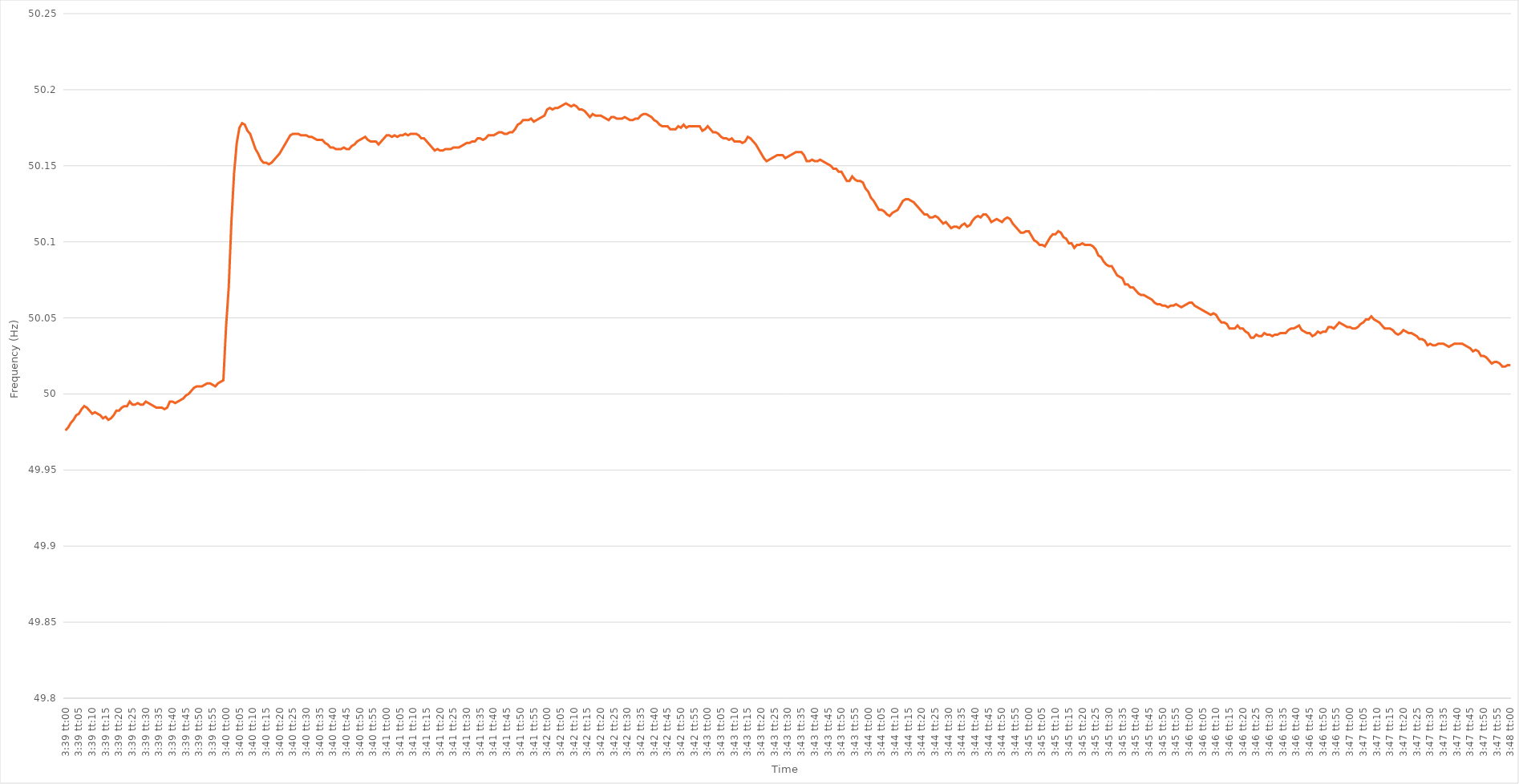
| Category | Series 0 |
|---|---|
| 0.15208333333333332 | 49.976 |
| 0.15209490740740741 | 49.978 |
| 0.15210648148148148 | 49.981 |
| 0.15211805555555555 | 49.983 |
| 0.15212962962962964 | 49.986 |
| 0.1521412037037037 | 49.987 |
| 0.15215277777777778 | 49.99 |
| 0.15216435185185184 | 49.992 |
| 0.1521759259259259 | 49.991 |
| 0.1521875 | 49.989 |
| 0.15219907407407407 | 49.987 |
| 0.15221064814814814 | 49.988 |
| 0.15222222222222223 | 49.987 |
| 0.1522337962962963 | 49.986 |
| 0.15224537037037036 | 49.984 |
| 0.15225694444444446 | 49.985 |
| 0.15226851851851853 | 49.983 |
| 0.1522800925925926 | 49.984 |
| 0.15229166666666666 | 49.986 |
| 0.15230324074074075 | 49.989 |
| 0.15231481481481482 | 49.989 |
| 0.1523263888888889 | 49.991 |
| 0.15233796296296295 | 49.992 |
| 0.15234953703703705 | 49.992 |
| 0.1523611111111111 | 49.995 |
| 0.15237268518518518 | 49.993 |
| 0.15238425925925925 | 49.993 |
| 0.15239583333333334 | 49.994 |
| 0.1524074074074074 | 49.993 |
| 0.15241898148148147 | 49.993 |
| 0.15243055555555554 | 49.995 |
| 0.15244212962962964 | 49.994 |
| 0.1524537037037037 | 49.993 |
| 0.15246527777777777 | 49.992 |
| 0.15247685185185186 | 49.991 |
| 0.15248842592592593 | 49.991 |
| 0.1525 | 49.991 |
| 0.1525115740740741 | 49.99 |
| 0.15252314814814816 | 49.991 |
| 0.15253472222222222 | 49.995 |
| 0.1525462962962963 | 49.995 |
| 0.15255787037037036 | 49.994 |
| 0.15256944444444445 | 49.995 |
| 0.15258101851851852 | 49.996 |
| 0.15259259259259259 | 49.997 |
| 0.15260416666666668 | 49.999 |
| 0.15261574074074075 | 50 |
| 0.1526273148148148 | 50.002 |
| 0.15263888888888888 | 50.004 |
| 0.15265046296296295 | 50.005 |
| 0.15266203703703704 | 50.005 |
| 0.1526736111111111 | 50.005 |
| 0.15268518518518517 | 50.006 |
| 0.15269675925925927 | 50.007 |
| 0.15270833333333333 | 50.007 |
| 0.1527199074074074 | 50.006 |
| 0.1527314814814815 | 50.005 |
| 0.15274305555555556 | 50.007 |
| 0.15275462962962963 | 50.008 |
| 0.15276620370370372 | 50.009 |
| 0.15277777777777776 | 50.044 |
| 0.15278935185185186 | 50.07 |
| 0.15280092592592592 | 50.113 |
| 0.1528125 | 50.145 |
| 0.15282407407407408 | 50.165 |
| 0.15283564814814815 | 50.175 |
| 0.15284722222222222 | 50.178 |
| 0.1528587962962963 | 50.177 |
| 0.15287037037037035 | 50.173 |
| 0.15288194444444445 | 50.171 |
| 0.1528935185185185 | 50.166 |
| 0.15290509259259258 | 50.161 |
| 0.15291666666666667 | 50.158 |
| 0.15292824074074074 | 50.154 |
| 0.1529398148148148 | 50.152 |
| 0.1529513888888889 | 50.152 |
| 0.15296296296296297 | 50.151 |
| 0.15297453703703703 | 50.152 |
| 0.15298611111111113 | 50.154 |
| 0.1529976851851852 | 50.156 |
| 0.15300925925925926 | 50.158 |
| 0.15302083333333333 | 50.161 |
| 0.1530324074074074 | 50.164 |
| 0.1530439814814815 | 50.167 |
| 0.15305555555555556 | 50.17 |
| 0.15306712962962962 | 50.171 |
| 0.15307870370370372 | 50.171 |
| 0.15309027777777778 | 50.171 |
| 0.15310185185185185 | 50.17 |
| 0.15311342592592592 | 50.17 |
| 0.15312499999999998 | 50.17 |
| 0.15313657407407408 | 50.169 |
| 0.15314814814814814 | 50.169 |
| 0.1531597222222222 | 50.168 |
| 0.1531712962962963 | 50.167 |
| 0.15318287037037037 | 50.167 |
| 0.15319444444444444 | 50.167 |
| 0.15320601851851853 | 50.165 |
| 0.1532175925925926 | 50.164 |
| 0.15322916666666667 | 50.162 |
| 0.15324074074074073 | 50.162 |
| 0.1532523148148148 | 50.161 |
| 0.1532638888888889 | 50.161 |
| 0.15327546296296296 | 50.161 |
| 0.15328703703703703 | 50.162 |
| 0.15329861111111112 | 50.161 |
| 0.1533101851851852 | 50.161 |
| 0.15332175925925925 | 50.163 |
| 0.15333333333333332 | 50.164 |
| 0.15334490740740742 | 50.166 |
| 0.15335648148148148 | 50.167 |
| 0.15336805555555555 | 50.168 |
| 0.15337962962962962 | 50.169 |
| 0.1533912037037037 | 50.167 |
| 0.15340277777777778 | 50.166 |
| 0.15341435185185184 | 50.166 |
| 0.15342592592592594 | 50.166 |
| 0.1534375 | 50.164 |
| 0.15344907407407407 | 50.166 |
| 0.15346064814814817 | 50.168 |
| 0.15347222222222223 | 50.17 |
| 0.1534837962962963 | 50.17 |
| 0.15349537037037037 | 50.169 |
| 0.15350694444444443 | 50.17 |
| 0.15351851851851853 | 50.169 |
| 0.1535300925925926 | 50.17 |
| 0.15354166666666666 | 50.17 |
| 0.15355324074074075 | 50.171 |
| 0.15356481481481482 | 50.17 |
| 0.1535763888888889 | 50.171 |
| 0.15358796296296295 | 50.171 |
| 0.15359953703703702 | 50.171 |
| 0.15361111111111111 | 50.17 |
| 0.15362268518518518 | 50.168 |
| 0.15363425925925925 | 50.168 |
| 0.15364583333333334 | 50.166 |
| 0.1536574074074074 | 50.164 |
| 0.15366898148148148 | 50.162 |
| 0.15368055555555557 | 50.16 |
| 0.15369212962962964 | 50.161 |
| 0.1537037037037037 | 50.16 |
| 0.1537152777777778 | 50.16 |
| 0.15372685185185184 | 50.161 |
| 0.15373842592592593 | 50.161 |
| 0.15375 | 50.161 |
| 0.15376157407407406 | 50.162 |
| 0.15377314814814816 | 50.162 |
| 0.15378472222222223 | 50.162 |
| 0.1537962962962963 | 50.163 |
| 0.1538078703703704 | 50.164 |
| 0.15381944444444443 | 50.165 |
| 0.15383101851851852 | 50.165 |
| 0.1538425925925926 | 50.166 |
| 0.15385416666666665 | 50.166 |
| 0.15386574074074075 | 50.168 |
| 0.15387731481481481 | 50.168 |
| 0.15388888888888888 | 50.167 |
| 0.15390046296296298 | 50.168 |
| 0.15391203703703704 | 50.17 |
| 0.1539236111111111 | 50.17 |
| 0.1539351851851852 | 50.17 |
| 0.15394675925925924 | 50.171 |
| 0.15395833333333334 | 50.172 |
| 0.1539699074074074 | 50.172 |
| 0.15398148148148147 | 50.171 |
| 0.15399305555555556 | 50.171 |
| 0.15400462962962963 | 50.172 |
| 0.1540162037037037 | 50.172 |
| 0.1540277777777778 | 50.174 |
| 0.15403935185185186 | 50.177 |
| 0.15405092592592592 | 50.178 |
| 0.1540625 | 50.18 |
| 0.15407407407407406 | 50.18 |
| 0.15408564814814815 | 50.18 |
| 0.15409722222222222 | 50.181 |
| 0.15410879629629629 | 50.179 |
| 0.15412037037037038 | 50.18 |
| 0.15413194444444445 | 50.181 |
| 0.1541435185185185 | 50.182 |
| 0.1541550925925926 | 50.183 |
| 0.15416666666666667 | 50.187 |
| 0.15417824074074074 | 50.188 |
| 0.1541898148148148 | 50.187 |
| 0.15420138888888887 | 50.188 |
| 0.15421296296296297 | 50.188 |
| 0.15422453703703703 | 50.189 |
| 0.1542361111111111 | 50.19 |
| 0.1542476851851852 | 50.191 |
| 0.15425925925925926 | 50.19 |
| 0.15427083333333333 | 50.189 |
| 0.1542824074074074 | 50.19 |
| 0.15429398148148146 | 50.189 |
| 0.15430555555555556 | 50.187 |
| 0.15431712962962962 | 50.187 |
| 0.1543287037037037 | 50.186 |
| 0.15434027777777778 | 50.184 |
| 0.15435185185185185 | 50.182 |
| 0.15436342592592592 | 50.184 |
| 0.154375 | 50.183 |
| 0.15438657407407408 | 50.183 |
| 0.15439814814814815 | 50.183 |
| 0.15440972222222224 | 50.182 |
| 0.1544212962962963 | 50.181 |
| 0.15443287037037037 | 50.18 |
| 0.15444444444444444 | 50.182 |
| 0.1544560185185185 | 50.182 |
| 0.1544675925925926 | 50.181 |
| 0.15447916666666667 | 50.181 |
| 0.15449074074074073 | 50.181 |
| 0.15450231481481483 | 50.182 |
| 0.1545138888888889 | 50.181 |
| 0.15452546296296296 | 50.18 |
| 0.15453703703703703 | 50.18 |
| 0.1545486111111111 | 50.181 |
| 0.1545601851851852 | 50.181 |
| 0.15457175925925926 | 50.183 |
| 0.15458333333333332 | 50.184 |
| 0.15459490740740742 | 50.184 |
| 0.15460648148148148 | 50.183 |
| 0.15461805555555555 | 50.182 |
| 0.15462962962962964 | 50.18 |
| 0.1546412037037037 | 50.179 |
| 0.15465277777777778 | 50.177 |
| 0.15466435185185187 | 50.176 |
| 0.1546759259259259 | 50.176 |
| 0.1546875 | 50.176 |
| 0.15469907407407407 | 50.174 |
| 0.15471064814814814 | 50.174 |
| 0.15472222222222223 | 50.174 |
| 0.1547337962962963 | 50.176 |
| 0.15474537037037037 | 50.175 |
| 0.15475694444444446 | 50.177 |
| 0.1547685185185185 | 50.175 |
| 0.1547800925925926 | 50.176 |
| 0.15479166666666666 | 50.176 |
| 0.15480324074074073 | 50.176 |
| 0.15481481481481482 | 50.176 |
| 0.1548263888888889 | 50.176 |
| 0.15483796296296296 | 50.173 |
| 0.15484953703703705 | 50.174 |
| 0.15486111111111112 | 50.176 |
| 0.15487268518518518 | 50.174 |
| 0.15488425925925928 | 50.172 |
| 0.15489583333333332 | 50.172 |
| 0.1549074074074074 | 50.171 |
| 0.15491898148148148 | 50.169 |
| 0.15493055555555554 | 50.168 |
| 0.15494212962962964 | 50.168 |
| 0.1549537037037037 | 50.167 |
| 0.15496527777777777 | 50.168 |
| 0.15497685185185187 | 50.166 |
| 0.1549884259259259 | 50.166 |
| 0.155 | 50.166 |
| 0.15501157407407407 | 50.165 |
| 0.15502314814814813 | 50.166 |
| 0.15503472222222223 | 50.169 |
| 0.1550462962962963 | 50.168 |
| 0.15505787037037036 | 50.166 |
| 0.15506944444444445 | 50.164 |
| 0.15508101851851852 | 50.161 |
| 0.1550925925925926 | 50.158 |
| 0.15510416666666668 | 50.155 |
| 0.15511574074074075 | 50.153 |
| 0.15512731481481482 | 50.154 |
| 0.15513888888888888 | 50.155 |
| 0.15515046296296295 | 50.156 |
| 0.15516203703703704 | 50.157 |
| 0.1551736111111111 | 50.157 |
| 0.15518518518518518 | 50.157 |
| 0.15519675925925927 | 50.155 |
| 0.15520833333333334 | 50.156 |
| 0.1552199074074074 | 50.157 |
| 0.15523148148148147 | 50.158 |
| 0.15524305555555554 | 50.159 |
| 0.15525462962962963 | 50.159 |
| 0.1552662037037037 | 50.159 |
| 0.15527777777777776 | 50.157 |
| 0.15528935185185186 | 50.153 |
| 0.15530092592592593 | 50.153 |
| 0.1553125 | 50.154 |
| 0.1553240740740741 | 50.153 |
| 0.15533564814814815 | 50.153 |
| 0.15534722222222222 | 50.154 |
| 0.15535879629629631 | 50.153 |
| 0.15537037037037038 | 50.152 |
| 0.15538194444444445 | 50.151 |
| 0.15539351851851851 | 50.15 |
| 0.15540509259259258 | 50.148 |
| 0.15541666666666668 | 50.148 |
| 0.15542824074074074 | 50.146 |
| 0.1554398148148148 | 50.146 |
| 0.1554513888888889 | 50.143 |
| 0.15546296296296297 | 50.14 |
| 0.15547453703703704 | 50.14 |
| 0.1554861111111111 | 50.143 |
| 0.15549768518518517 | 50.141 |
| 0.15550925925925926 | 50.14 |
| 0.15552083333333333 | 50.14 |
| 0.1555324074074074 | 50.139 |
| 0.1555439814814815 | 50.135 |
| 0.15555555555555556 | 50.133 |
| 0.15556712962962962 | 50.129 |
| 0.15557870370370372 | 50.127 |
| 0.15559027777777779 | 50.124 |
| 0.15560185185185185 | 50.121 |
| 0.15561342592592595 | 50.121 |
| 0.15562499999999999 | 50.12 |
| 0.15563657407407408 | 50.118 |
| 0.15564814814814815 | 50.117 |
| 0.1556597222222222 | 50.119 |
| 0.1556712962962963 | 50.12 |
| 0.15568287037037037 | 50.121 |
| 0.15569444444444444 | 50.124 |
| 0.15570601851851854 | 50.127 |
| 0.15571759259259257 | 50.128 |
| 0.15572916666666667 | 50.128 |
| 0.15574074074074074 | 50.127 |
| 0.1557523148148148 | 50.126 |
| 0.1557638888888889 | 50.124 |
| 0.15577546296296296 | 50.122 |
| 0.15578703703703703 | 50.12 |
| 0.15579861111111112 | 50.118 |
| 0.1558101851851852 | 50.118 |
| 0.15582175925925926 | 50.116 |
| 0.15583333333333335 | 50.116 |
| 0.1558449074074074 | 50.117 |
| 0.15585648148148148 | 50.116 |
| 0.15586805555555555 | 50.114 |
| 0.15587962962962962 | 50.112 |
| 0.1558912037037037 | 50.113 |
| 0.15590277777777778 | 50.111 |
| 0.15591435185185185 | 50.109 |
| 0.15592592592592594 | 50.11 |
| 0.15593749999999998 | 50.11 |
| 0.15594907407407407 | 50.109 |
| 0.15596064814814814 | 50.111 |
| 0.1559722222222222 | 50.112 |
| 0.1559837962962963 | 50.11 |
| 0.15599537037037037 | 50.111 |
| 0.15600694444444443 | 50.114 |
| 0.15601851851851853 | 50.116 |
| 0.1560300925925926 | 50.117 |
| 0.15604166666666666 | 50.116 |
| 0.15605324074074076 | 50.118 |
| 0.15606481481481482 | 50.118 |
| 0.1560763888888889 | 50.116 |
| 0.15608796296296296 | 50.113 |
| 0.15609953703703702 | 50.114 |
| 0.15611111111111112 | 50.115 |
| 0.15612268518518518 | 50.114 |
| 0.15613425925925925 | 50.113 |
| 0.15614583333333334 | 50.115 |
| 0.1561574074074074 | 50.116 |
| 0.15616898148148148 | 50.115 |
| 0.15618055555555554 | 50.112 |
| 0.1561921296296296 | 50.11 |
| 0.1562037037037037 | 50.108 |
| 0.15621527777777777 | 50.106 |
| 0.15622685185185184 | 50.106 |
| 0.15623842592592593 | 50.107 |
| 0.15625 | 50.107 |
| 0.15626157407407407 | 50.104 |
| 0.15627314814814816 | 50.101 |
| 0.15628472222222223 | 50.1 |
| 0.1562962962962963 | 50.098 |
| 0.1563078703703704 | 50.098 |
| 0.15631944444444446 | 50.097 |
| 0.15633101851851852 | 50.1 |
| 0.1563425925925926 | 50.103 |
| 0.15635416666666666 | 50.105 |
| 0.15636574074074075 | 50.105 |
| 0.15637731481481482 | 50.107 |
| 0.15638888888888888 | 50.106 |
| 0.15640046296296298 | 50.103 |
| 0.15641203703703704 | 50.102 |
| 0.1564236111111111 | 50.099 |
| 0.15643518518518518 | 50.099 |
| 0.15644675925925924 | 50.096 |
| 0.15645833333333334 | 50.098 |
| 0.1564699074074074 | 50.098 |
| 0.15648148148148147 | 50.099 |
| 0.15649305555555557 | 50.098 |
| 0.15650462962962963 | 50.098 |
| 0.1565162037037037 | 50.098 |
| 0.1565277777777778 | 50.097 |
| 0.15653935185185186 | 50.095 |
| 0.15655092592592593 | 50.091 |
| 0.15656250000000002 | 50.09 |
| 0.15657407407407406 | 50.087 |
| 0.15658564814814815 | 50.085 |
| 0.15659722222222222 | 50.084 |
| 0.1566087962962963 | 50.084 |
| 0.15662037037037038 | 50.081 |
| 0.15663194444444445 | 50.078 |
| 0.15664351851851852 | 50.077 |
| 0.1566550925925926 | 50.076 |
| 0.15666666666666665 | 50.072 |
| 0.15667824074074074 | 50.072 |
| 0.1566898148148148 | 50.07 |
| 0.15670138888888888 | 50.07 |
| 0.15671296296296297 | 50.068 |
| 0.15672453703703704 | 50.066 |
| 0.1567361111111111 | 50.065 |
| 0.1567476851851852 | 50.065 |
| 0.15675925925925926 | 50.064 |
| 0.15677083333333333 | 50.063 |
| 0.15678240740740743 | 50.062 |
| 0.15679398148148146 | 50.06 |
| 0.15680555555555556 | 50.059 |
| 0.15681712962962963 | 50.059 |
| 0.1568287037037037 | 50.058 |
| 0.1568402777777778 | 50.058 |
| 0.15685185185185185 | 50.057 |
| 0.15686342592592592 | 50.058 |
| 0.15687500000000001 | 50.058 |
| 0.15688657407407405 | 50.059 |
| 0.15689814814814815 | 50.058 |
| 0.15690972222222221 | 50.057 |
| 0.15692129629629628 | 50.058 |
| 0.15693287037037038 | 50.059 |
| 0.15694444444444444 | 50.06 |
| 0.1569560185185185 | 50.06 |
| 0.1569675925925926 | 50.058 |
| 0.15697916666666667 | 50.057 |
| 0.15699074074074074 | 50.056 |
| 0.15700231481481483 | 50.055 |
| 0.1570138888888889 | 50.054 |
| 0.15702546296296296 | 50.053 |
| 0.15703703703703703 | 50.052 |
| 0.1570486111111111 | 50.053 |
| 0.1570601851851852 | 50.052 |
| 0.15707175925925926 | 50.049 |
| 0.15708333333333332 | 50.047 |
| 0.15709490740740742 | 50.047 |
| 0.15710648148148149 | 50.046 |
| 0.15711805555555555 | 50.043 |
| 0.15712962962962962 | 50.043 |
| 0.15714120370370369 | 50.043 |
| 0.15715277777777778 | 50.045 |
| 0.15716435185185185 | 50.043 |
| 0.1571759259259259 | 50.043 |
| 0.1571875 | 50.041 |
| 0.15719907407407407 | 50.04 |
| 0.15721064814814814 | 50.037 |
| 0.15722222222222224 | 50.037 |
| 0.1572337962962963 | 50.039 |
| 0.15724537037037037 | 50.038 |
| 0.15725694444444446 | 50.038 |
| 0.15726851851851853 | 50.04 |
| 0.1572800925925926 | 50.039 |
| 0.15729166666666666 | 50.039 |
| 0.15730324074074073 | 50.038 |
| 0.15731481481481482 | 50.039 |
| 0.1573263888888889 | 50.039 |
| 0.15733796296296296 | 50.04 |
| 0.15734953703703705 | 50.04 |
| 0.15736111111111112 | 50.04 |
| 0.15737268518518518 | 50.042 |
| 0.15738425925925925 | 50.043 |
| 0.15739583333333332 | 50.043 |
| 0.1574074074074074 | 50.044 |
| 0.15741898148148148 | 50.045 |
| 0.15743055555555555 | 50.042 |
| 0.15744212962962964 | 50.041 |
| 0.1574537037037037 | 50.04 |
| 0.15746527777777777 | 50.04 |
| 0.15747685185185187 | 50.038 |
| 0.15748842592592593 | 50.039 |
| 0.1575 | 50.041 |
| 0.1575115740740741 | 50.04 |
| 0.15752314814814813 | 50.041 |
| 0.15753472222222223 | 50.041 |
| 0.1575462962962963 | 50.044 |
| 0.15755787037037036 | 50.044 |
| 0.15756944444444446 | 50.043 |
| 0.15758101851851852 | 50.045 |
| 0.1575925925925926 | 50.047 |
| 0.15760416666666668 | 50.046 |
| 0.15761574074074072 | 50.045 |
| 0.15762731481481482 | 50.044 |
| 0.15763888888888888 | 50.044 |
| 0.15765046296296295 | 50.043 |
| 0.15766203703703704 | 50.043 |
| 0.1576736111111111 | 50.044 |
| 0.15768518518518518 | 50.046 |
| 0.15769675925925927 | 50.047 |
| 0.15770833333333334 | 50.049 |
| 0.1577199074074074 | 50.049 |
| 0.1577314814814815 | 50.051 |
| 0.15774305555555554 | 50.049 |
| 0.15775462962962963 | 50.048 |
| 0.1577662037037037 | 50.047 |
| 0.15777777777777777 | 50.045 |
| 0.15778935185185186 | 50.043 |
| 0.15780092592592593 | 50.043 |
| 0.1578125 | 50.043 |
| 0.1578240740740741 | 50.042 |
| 0.15783564814814813 | 50.04 |
| 0.15784722222222222 | 50.039 |
| 0.1578587962962963 | 50.04 |
| 0.15787037037037036 | 50.042 |
| 0.15788194444444445 | 50.041 |
| 0.15789351851851852 | 50.04 |
| 0.15790509259259258 | 50.04 |
| 0.15791666666666668 | 50.039 |
| 0.15792824074074074 | 50.038 |
| 0.1579398148148148 | 50.036 |
| 0.1579513888888889 | 50.036 |
| 0.15796296296296297 | 50.035 |
| 0.15797453703703704 | 50.032 |
| 0.1579861111111111 | 50.033 |
| 0.15799768518518517 | 50.032 |
| 0.15800925925925927 | 50.032 |
| 0.15802083333333333 | 50.033 |
| 0.1580324074074074 | 50.033 |
| 0.1580439814814815 | 50.033 |
| 0.15805555555555556 | 50.032 |
| 0.15806712962962963 | 50.031 |
| 0.1580787037037037 | 50.032 |
| 0.15809027777777776 | 50.033 |
| 0.15810185185185185 | 50.033 |
| 0.15811342592592592 | 50.033 |
| 0.158125 | 50.033 |
| 0.15813657407407408 | 50.032 |
| 0.15814814814814815 | 50.031 |
| 0.15815972222222222 | 50.03 |
| 0.1581712962962963 | 50.028 |
| 0.15818287037037038 | 50.029 |
| 0.15819444444444444 | 50.028 |
| 0.15820601851851854 | 50.025 |
| 0.1582175925925926 | 50.025 |
| 0.15822916666666667 | 50.024 |
| 0.15824074074074074 | 50.022 |
| 0.1582523148148148 | 50.02 |
| 0.1582638888888889 | 50.021 |
| 0.15827546296296297 | 50.021 |
| 0.15828703703703703 | 50.02 |
| 0.15829861111111113 | 50.018 |
| 0.1583101851851852 | 50.018 |
| 0.15832175925925926 | 50.019 |
| 0.15833333333333333 | 50.019 |